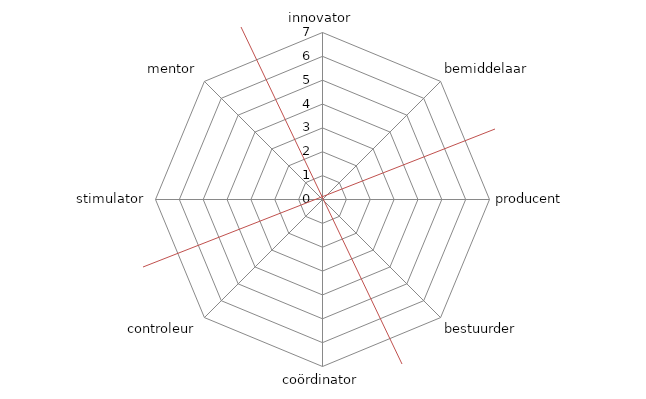
| Category | Series 0 |
|---|---|
| innovator | 0 |
| bemiddelaar | 0 |
| producent | 0 |
| bestuurder | 0 |
| coördinator | 0 |
| controleur | 0 |
| stimulator | 0 |
| mentor | 0 |